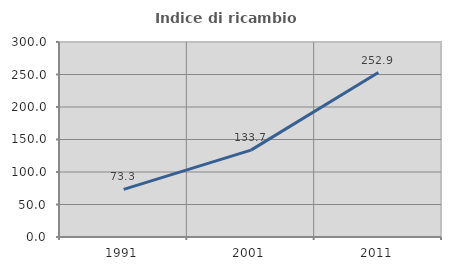
| Category | Indice di ricambio occupazionale  |
|---|---|
| 1991.0 | 73.26 |
| 2001.0 | 133.673 |
| 2011.0 | 252.941 |